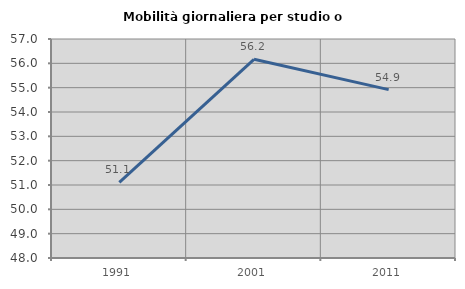
| Category | Mobilità giornaliera per studio o lavoro |
|---|---|
| 1991.0 | 51.111 |
| 2001.0 | 56.164 |
| 2011.0 | 54.918 |